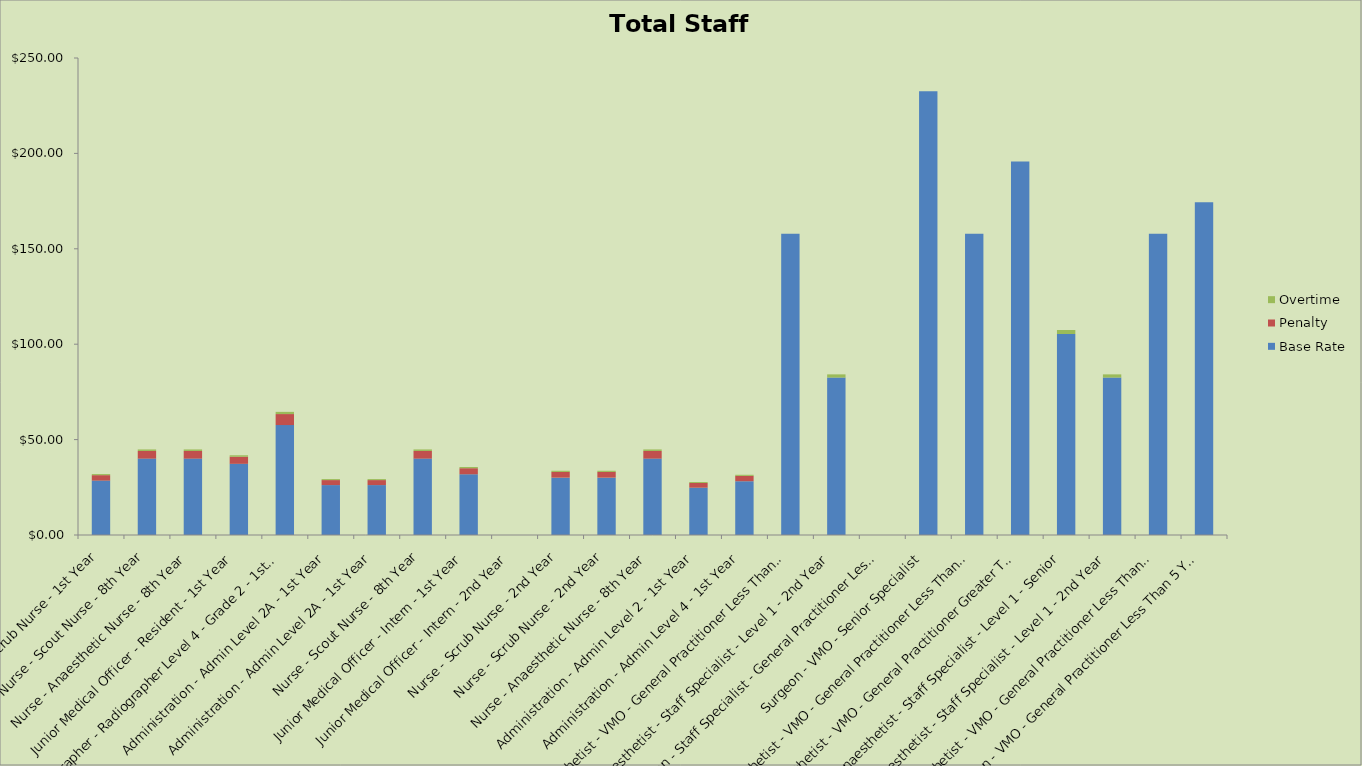
| Category | Base Rate | Penalty | Overtime |
|---|---|---|---|
| Nurse - Scrub Nurse - 1st Year | 28.51 | 2.851 | 0.57 |
| Nurse - Scout Nurse - 8th Year | 40.036 | 4.004 | 0.801 |
| Nurse - Anaesthetic Nurse - 8th Year | 40.036 | 4.004 | 0.801 |
| Junior Medical Officer - Resident - 1st Year | 37.302 | 3.73 | 0.746 |
| Radiographer - Radiographer Level 4 - Grade 2 - 1st Year | 57.621 | 5.762 | 1.152 |
| Administration - Admin Level 2A - 1st Year | 26.163 | 2.616 | 0.523 |
| Administration - Admin Level 2A - 1st Year | 26.163 | 2.616 | 0.523 |
| Nurse - Scout Nurse - 8th Year | 40.036 | 4.004 | 0.801 |
| Junior Medical Officer - Intern - 1st Year | 31.823 | 3.182 | 0.636 |
| Junior Medical Officer - Intern - 2nd Year | 0 | 0 | 0 |
| Nurse - Scrub Nurse - 2nd Year | 30.06 | 3.006 | 0.601 |
| Nurse - Scrub Nurse - 2nd Year | 30.06 | 3.006 | 0.601 |
| Nurse - Anaesthetic Nurse - 8th Year | 40.036 | 4.004 | 0.801 |
| Administration - Admin Level 2 - 1st Year | 24.797 | 2.48 | 0.496 |
| Administration - Admin Level 4 - 1st Year | 28.182 | 2.818 | 0.564 |
| Anaesthetist - VMO - General Practitioner Less Than 5 Years | 157.9 | 0 | 0 |
| Anaesthetist - Staff Specialist - Level 1 - 2nd Year | 82.534 | 0 | 1.651 |
| Surgeon - Staff Specialist - General Practitioner Less Than 5 Years | 0 | 0 | 0 |
| Surgeon - VMO - Senior Specialist | 232.6 | 0 | 0 |
| Anaesthetist - VMO - General Practitioner Less Than 5 Years | 157.9 | 0 | 0 |
| Anaesthetist - VMO - General Practitioner Greater Than 5 Years | 195.8 | 0 | 0 |
| Anaesthetist - Staff Specialist - Level 1 - Senior | 105.345 | 0 | 2.107 |
| Anaesthetist - Staff Specialist - Level 1 - 2nd Year | 82.534 | 0 | 1.651 |
| Anaesthetist - VMO - General Practitioner Less Than 5 Years | 157.9 | 0 | 0 |
| Surgeon - VMO - General Practitioner Less Than 5 Years | 174.45 | 0 | 0 |